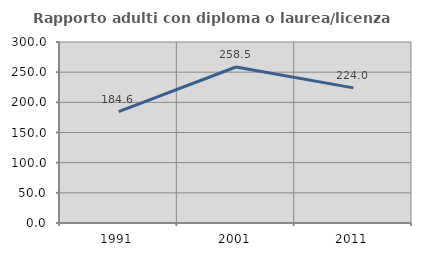
| Category | Rapporto adulti con diploma o laurea/licenza media  |
|---|---|
| 1991.0 | 184.615 |
| 2001.0 | 258.537 |
| 2011.0 | 224 |